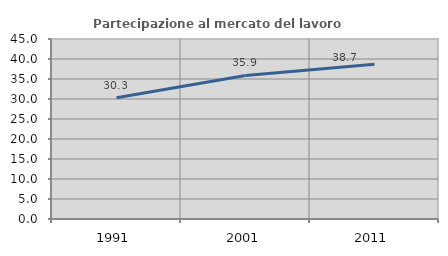
| Category | Partecipazione al mercato del lavoro  femminile |
|---|---|
| 1991.0 | 30.308 |
| 2001.0 | 35.897 |
| 2011.0 | 38.687 |